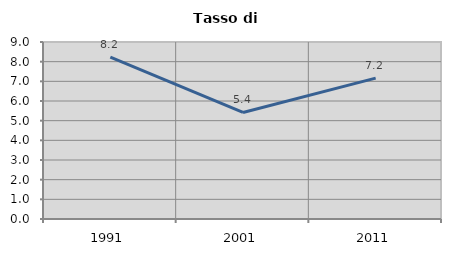
| Category | Tasso di disoccupazione   |
|---|---|
| 1991.0 | 8.229 |
| 2001.0 | 5.417 |
| 2011.0 | 7.163 |